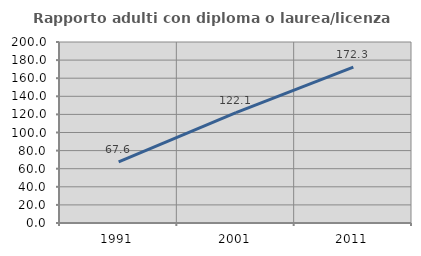
| Category | Rapporto adulti con diploma o laurea/licenza media  |
|---|---|
| 1991.0 | 67.583 |
| 2001.0 | 122.067 |
| 2011.0 | 172.337 |